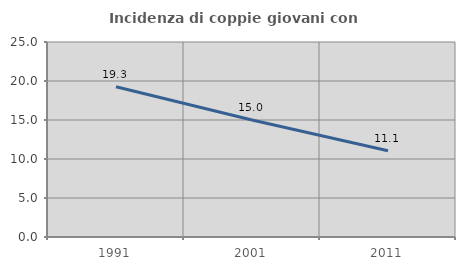
| Category | Incidenza di coppie giovani con figli |
|---|---|
| 1991.0 | 19.269 |
| 2001.0 | 15.008 |
| 2011.0 | 11.061 |